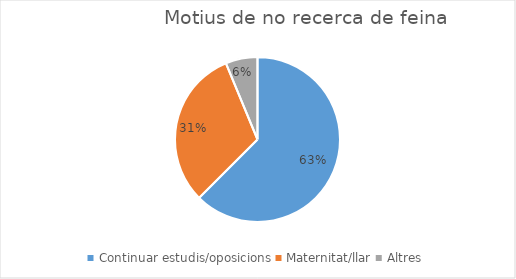
| Category | Series 0 |
|---|---|
| Continuar estudis/oposicions | 10 |
| Maternitat/llar | 5 |
| Altres | 1 |